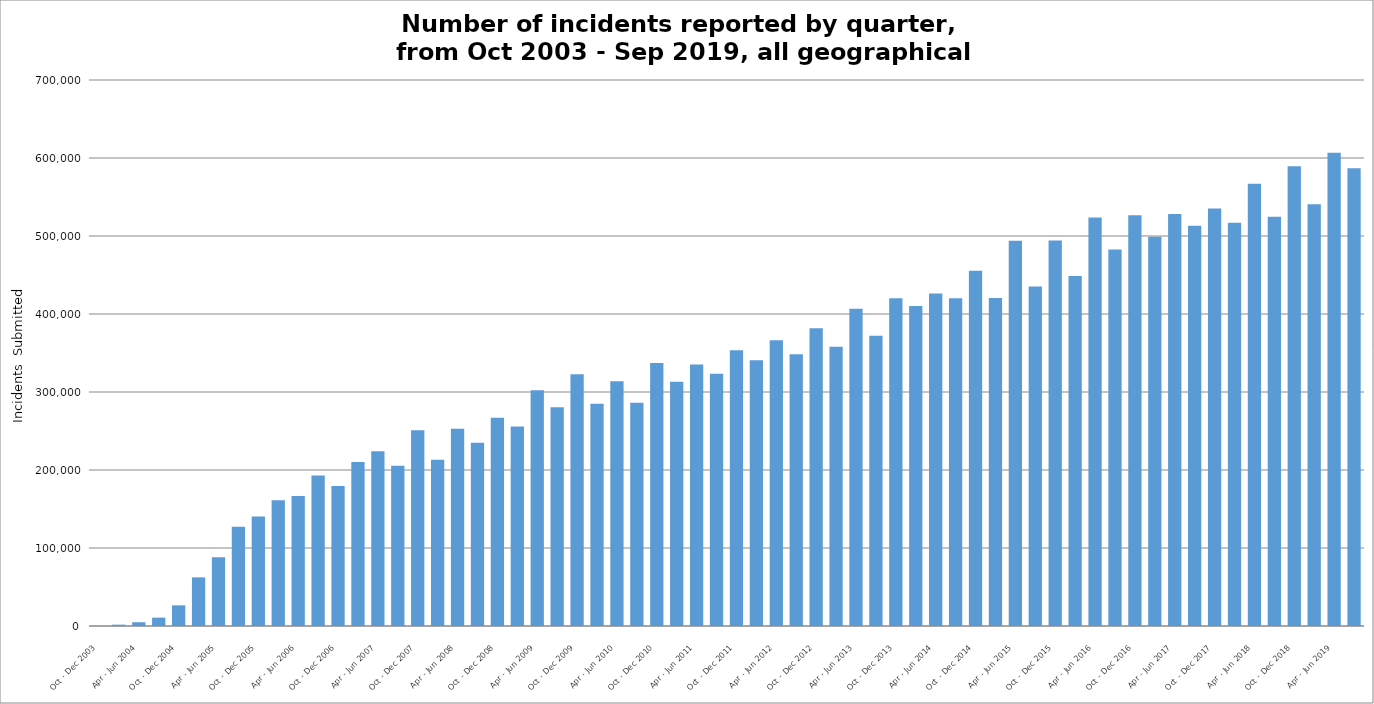
| Category | *All geographical locations |
|---|---|
| Oct - Dec 2003 | 158 |
| Jan - Mar 2004 | 1716 |
| Apr - Jun 2004 | 4823 |
| Jul - Sep 2004 | 10720 |
| Oct - Dec 2004 | 26508 |
| Jan - Mar 2005 | 62351 |
| Apr - Jun 2005 | 88042 |
| Jul - Sep 2005 | 127170 |
| Oct - Dec 2005 | 140394 |
| Jan - Mar 2006 | 161141 |
| Apr - Jun 2006 | 166539 |
| Jul - Sep 2006 | 192794 |
| Oct - Dec 2006 | 179538 |
| Jan - Mar 2007 | 210178 |
| Apr - Jun 2007 | 224047 |
| Jul - Sep 2007 | 205357 |
| Oct - Dec 2007 | 251010 |
| Jan - Mar 2008 | 213281 |
| Apr - Jun 2008 | 253006 |
| Jul - Sep 2008 | 234863 |
| Oct - Dec 2008 | 267135 |
| Jan - Mar 2009 | 255837 |
| Apr - Jun 2009 | 302198 |
| Jul - Sep 2009 | 280454 |
| Oct - Dec 2009 | 322757 |
| Jan - Mar 2010 | 284962 |
| Apr - Jun 2010 | 313827 |
| Jul - Sep 2010 | 286096 |
| Oct - Dec 2010 | 337149 |
| Jan - Mar 2011 | 312982 |
| Apr - Jun 2011 | 335327 |
| Jul - Sep 2011 | 323427 |
| Oct - Dec 2011 | 353578 |
| Jan - Mar 2012 | 340826 |
| Apr - Jun 2012 | 366262 |
| Jul - Sep 2012 | 348341 |
| Oct - Dec 2012 | 381754 |
| Jan - Mar 2013 | 358099 |
| Apr - Jun 2013 | 406617 |
| Jul - Sep 2013 | 372099 |
| Oct - Dec 2013 | 420297 |
| Jan - Mar 2014 | 410408 |
| Apr - Jun 2014 | 426315 |
| Jul - Sep 2014 | 420333 |
| Oct - Dec 2014 | 455584 |
| Jan - Mar 2015 | 420510 |
| Apr - Jun 2015 | 493795 |
| Jul - Sep 2015 | 435245 |
| Oct - Dec 2015 | 494082 |
| Jan - Mar 2016 | 448659 |
| Apr - Jun 2016 | 523610 |
| Jul - Sep 2016 | 482727 |
| Oct - Dec 2016 | 526580 |
| Jan - Mar 2017 | 499023 |
| Apr - Jun 2017 | 528164 |
| Jul - Sep 2017 | 513153 |
| Oct - Dec 2017 | 535229 |
| Jan - Mar 2018 | 516918 |
| Apr - Jun 2018 | 566898 |
| Jul - Sep 2018 | 524805 |
| Oct - Dec 2018 | 589471 |
| Jan - Mar 2019 | 540731 |
| Apr - Jun 2019 | 606613 |
| Jul - Sep 2019 | 586993 |